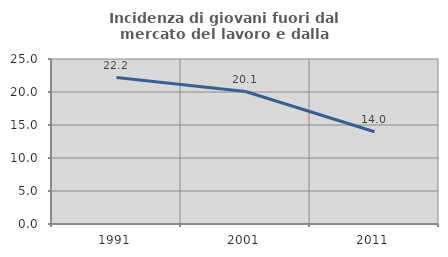
| Category | Incidenza di giovani fuori dal mercato del lavoro e dalla formazione  |
|---|---|
| 1991.0 | 22.189 |
| 2001.0 | 20.073 |
| 2011.0 | 13.977 |